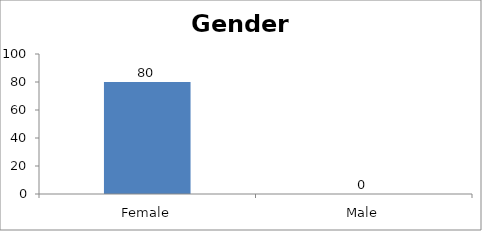
| Category | Gender |
|---|---|
| Female | 80 |
| Male | 0 |